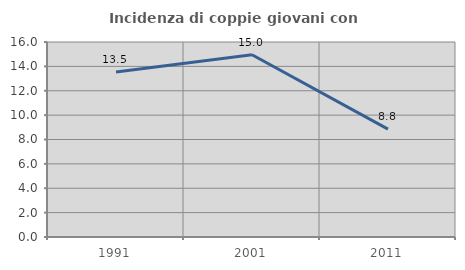
| Category | Incidenza di coppie giovani con figli |
|---|---|
| 1991.0 | 13.54 |
| 2001.0 | 14.955 |
| 2011.0 | 8.85 |